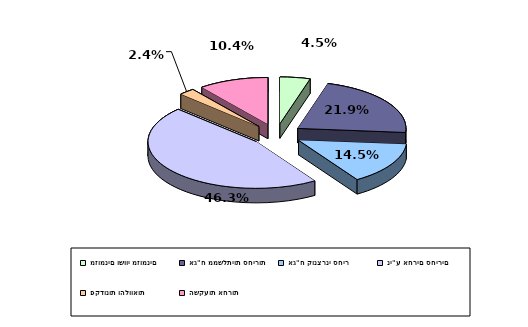
| Category | Series 0 |
|---|---|
| מזומנים ושווי מזומנים | 0.045 |
| אג"ח ממשלתיות סחירות | 0.219 |
| אג"ח קונצרני סחיר | 0.145 |
| ני"ע אחרים סחירים | 0.463 |
| פקדונות והלוואות | 0.024 |
| השקעות אחרות | 0.104 |